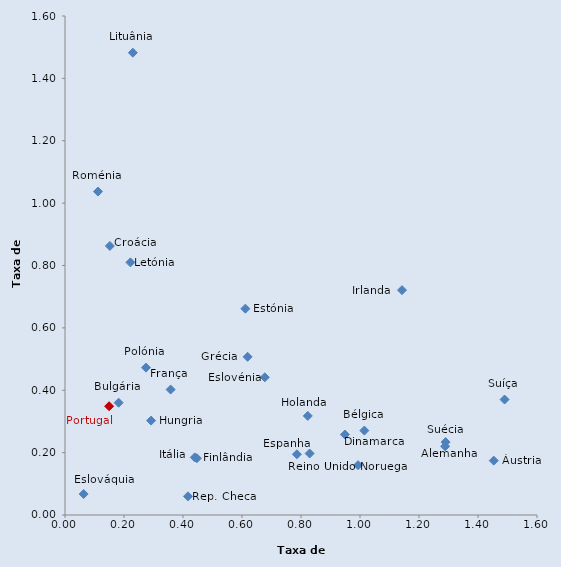
| Category | Series 0 |
|---|---|
| 1.4534277074963786 | 0.174 |
| 1.0147929278594252 | 0.271 |
| 0.1818682503985373 | 0.36 |
| 0.1520819322018635 | 0.863 |
| 0.41673852539511147 | 0.06 |
| 0.9487293417431387 | 0.258 |
| 0.6114357489479783 | 0.662 |
| 0.43993090175781624 | 0.185 |
| 0.3580978582537482 | 0.402 |
| 1.2885632581344497 | 0.22 |
| 0.6189764078380969 | 0.507 |
| 0.2918332577715957 | 0.303 |
| 1.142399340977944 | 0.721 |
| 0.44714269781510424 | 0.182 |
| 0.2216532668243703 | 0.81 |
| 0.23002581278867285 | 1.482 |
| 0.8229392967647464 | 0.318 |
| 0.9933976658675678 | 0.16 |
| 0.27452353284461495 | 0.473 |
| 0.14955331422553383 | 0.349 |
| 0.1118926170982176 | 1.037 |
| 0.06322566729947605 | 0.067 |
| 0.6773016508914885 | 0.442 |
| 0.7862187472223755 | 0.195 |
| 1.2902484580664182 | 0.234 |
| 1.490045245137935 | 0.37 |
| 0.82925100401716 | 0.197 |